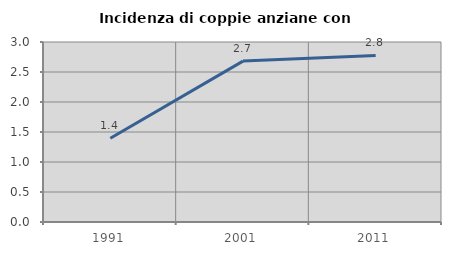
| Category | Incidenza di coppie anziane con figli |
|---|---|
| 1991.0 | 1.395 |
| 2001.0 | 2.682 |
| 2011.0 | 2.777 |